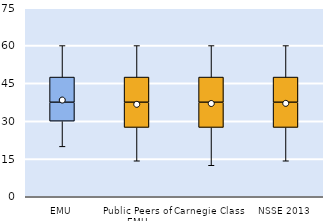
| Category | 25th | 50th | 75th |
|---|---|---|---|
| EMU | 30 | 7.5 | 10 |
| Public Peers of EMU | 27.5 | 10 | 10 |
| Carnegie Class | 27.5 | 10 | 10 |
| NSSE 2013 | 27.5 | 10 | 10 |